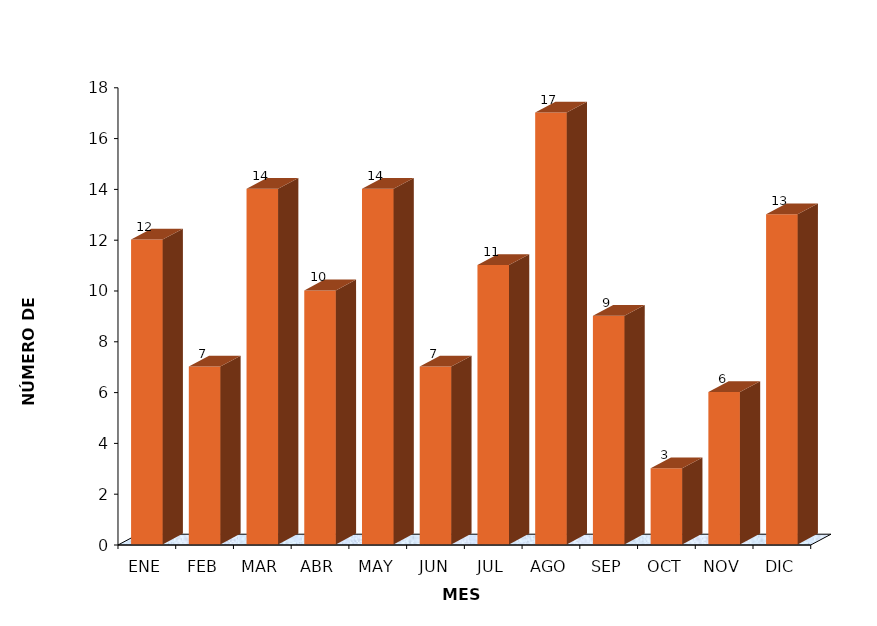
| Category | Series 0 |
|---|---|
| ENE | 12 |
| FEB | 7 |
| MAR | 14 |
| ABR | 10 |
| MAY | 14 |
| JUN | 7 |
| JUL | 11 |
| AGO | 17 |
| SEP | 9 |
| OCT | 3 |
| NOV | 6 |
| DIC | 13 |